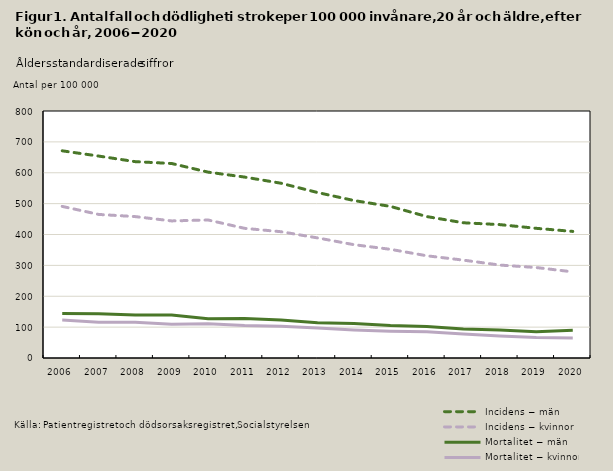
| Category | Incidens − män | Incidens − kvinnor | Mortalitet − män | Mortalitet − kvinnor |
|---|---|---|---|---|
| 2006.0 | 671 | 491 | 144 | 123 |
| 2007.0 | 654 | 465 | 143 | 116 |
| 2008.0 | 636 | 458 | 139 | 116 |
| 2009.0 | 630 | 444 | 139 | 109 |
| 2010.0 | 602 | 447 | 127 | 111 |
| 2011.0 | 586 | 420 | 128 | 105 |
| 2012.0 | 566 | 409 | 123 | 103 |
| 2013.0 | 536 | 389 | 114 | 97 |
| 2014.0 | 510 | 367 | 112 | 91 |
| 2015.0 | 491 | 352 | 105 | 87 |
| 2016.0 | 458 | 331 | 102 | 85 |
| 2017.0 | 438 | 317 | 94 | 78 |
| 2018.0 | 432 | 301 | 91 | 71 |
| 2019.0 | 420 | 293 | 85 | 66 |
| 2020.0 | 410 | 279 | 90 | 65 |